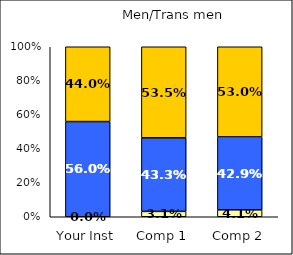
| Category | Low UG Ed Goal: Personal Development | Average UG Ed Goal: Personal Development | High UG Ed Goal: Personal Development |
|---|---|---|---|
| Your Inst | 0 | 0.56 | 0.44 |
| Comp 1 | 0.031 | 0.433 | 0.535 |
| Comp 2 | 0.041 | 0.429 | 0.53 |